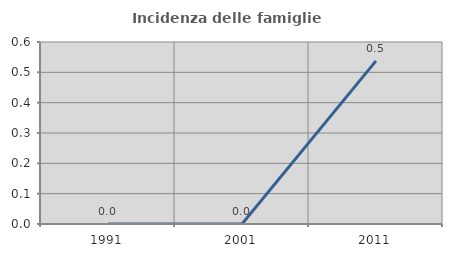
| Category | Incidenza delle famiglie numerose |
|---|---|
| 1991.0 | 0 |
| 2001.0 | 0 |
| 2011.0 | 0.538 |